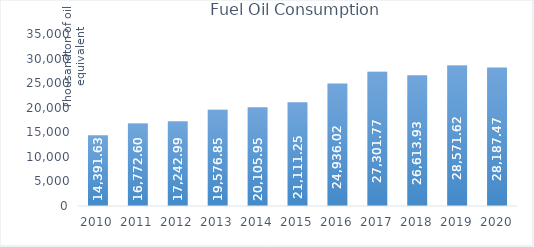
| Category | Fuel Oil Consumption |
|---|---|
| 2010.0 | 14391.63 |
| 2011.0 | 16772.6 |
| 2012.0 | 17242.99 |
| 2013.0 | 19576.85 |
| 2014.0 | 20105.95 |
| 2015.0 | 21111.25 |
| 2016.0 | 24936.02 |
| 2017.0 | 27301.77 |
| 2018.0 | 26613.93 |
| 2019.0 | 28571.62 |
| 2020.0 | 28187.47 |